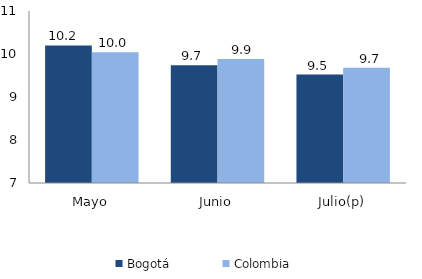
| Category | Bogotá | Colombia |
|---|---|---|
| Mayo | 10.198 | 10.039 |
| Junio | 9.736 | 9.881 |
| Julio(p) | 9.523 | 9.679 |